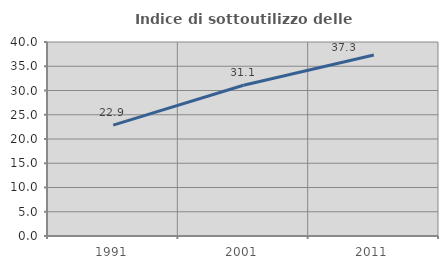
| Category | Indice di sottoutilizzo delle abitazioni  |
|---|---|
| 1991.0 | 22.864 |
| 2001.0 | 31.078 |
| 2011.0 | 37.33 |